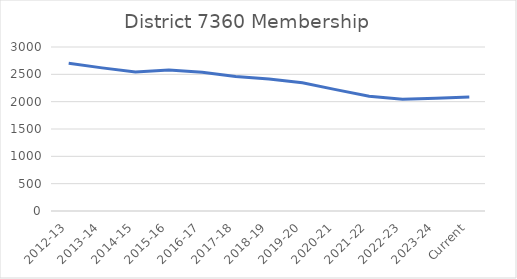
| Category | Series 0 |
|---|---|
| 2012-13 | 2704 |
| 2013-14 | 2618 |
| 2014-15 | 2542 |
| 2015-16 | 2579 |
| 2016-17 | 2538 |
| 2017-18 | 2459 |
| 2018-19 | 2413 |
| 2019-20 | 2345 |
| 2020-21 | 2220 |
| 2021-22 | 2100 |
| 2022-23 | 2045 |
| 2023-24 | 2062 |
| Current | 2085 |